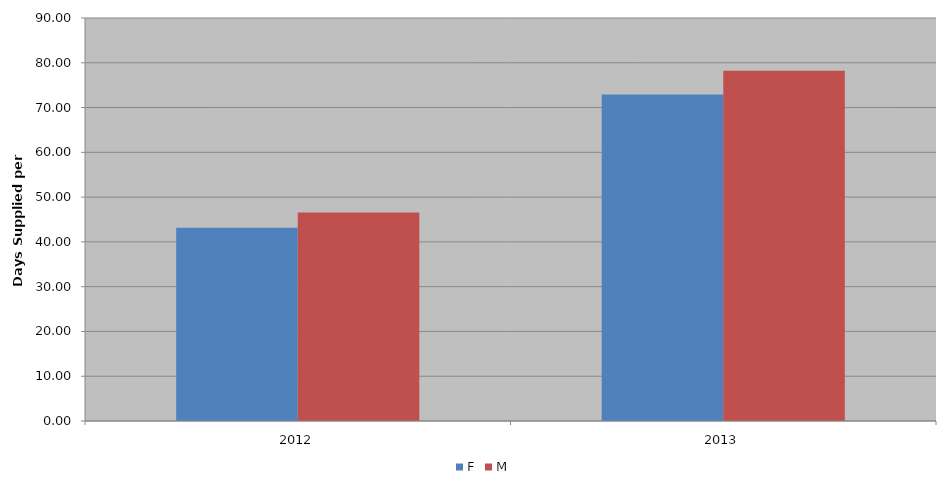
| Category | F | M |
|---|---|---|
| 2012 | 43.183 | 46.556 |
| 2013 | 72.918 | 78.215 |